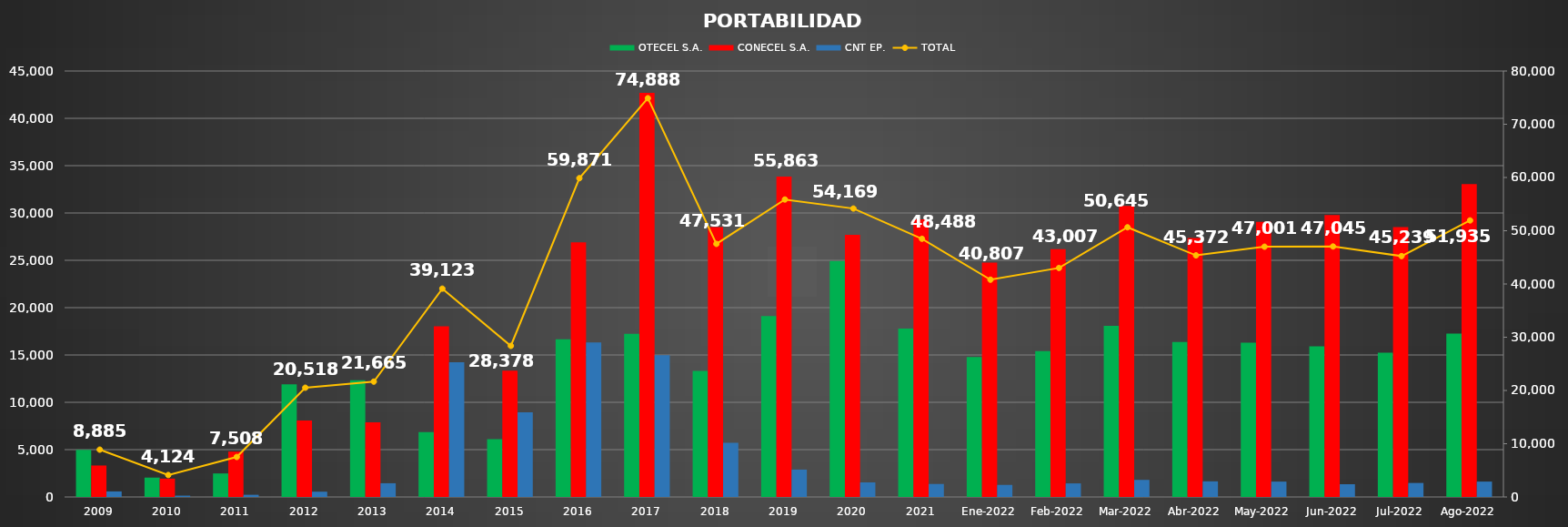
| Category | OTECEL S.A. | CONECEL S.A. | CNT EP. |
|---|---|---|---|
| 2009 | 4973 | 3324 | 588 |
| 2010 | 2045 | 1939 | 140 |
| 2011 | 2484 | 4796 | 228 |
| 2012 | 11894 | 8067 | 557 |
| 2013 | 12323 | 7893 | 1449 |
| 2014 | 6853 | 18039 | 14231 |
| 2015 | 6105 | 13334 | 8939 |
| 2016 | 16653 | 26907 | 16311 |
| 2017 | 17228 | 42694 | 14966 |
| 2018 | 13309 | 28504 | 5718 |
| 2019 | 19116 | 33857 | 2890 |
| 2020 | 24933 | 27700 | 1536 |
| 2021 | 17795 | 29321 | 1372 |
| Ene-2022 | 14781 | 24752 | 1274 |
| Feb-2022 | 15406 | 26168 | 1433 |
| Mar-2022 | 18084 | 30756 | 1805 |
| Abr-2022 | 16370 | 27352 | 1650 |
| May-2022 | 16305 | 29073 | 1623 |
| Jun-2022 | 15912 | 29786 | 1347 |
| Jul-2022 | 15250 | 28511 | 1478 |
| Ago-2022 | 17256 | 33054 | 1625 |